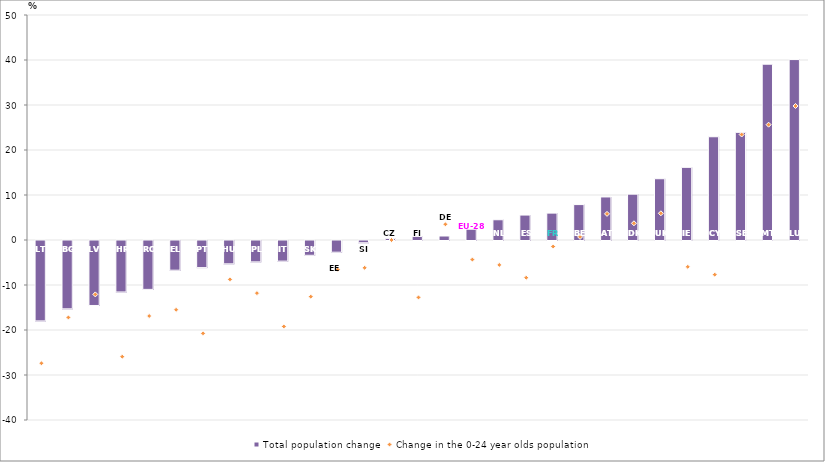
| Category | Total population change |
|---|---|
| LT | -17.865 |
| BG | -15.181 |
| LV | -14.439 |
| HR | -11.439 |
| RO | -10.862 |
| EL | -6.599 |
| PT | -6.022 |
| HU | -5.181 |
| PL | -4.747 |
| IT | -4.585 |
| SK | -3.285 |
| EE | -2.6 |
| SI | -0.499 |
| CZ | 0.362 |
| FI | 0.802 |
| DE | 0.885 |
| EU-28 | 2.396 |
| NL | 4.499 |
| ES | 5.545 |
| FR | 5.977 |
| BE | 7.87 |
| AT | 9.568 |
| DK | 10.186 |
| UK | 13.612 |
| IE | 16.146 |
| CY | 22.942 |
| SE | 23.918 |
| MT | 39.068 |
| LU | 40.095 |